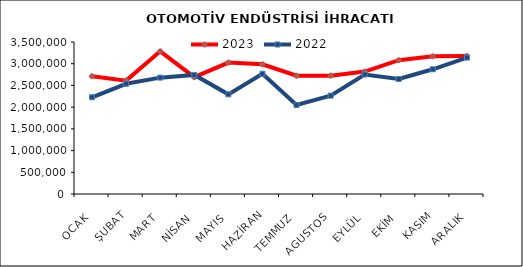
| Category | 2023 | 2022 |
|---|---|---|
| OCAK | 2711996.132 | 2227429.8 |
| ŞUBAT | 2610330.683 | 2537876.192 |
| MART | 3284639.724 | 2679350.728 |
| NİSAN | 2690029.23 | 2742241.719 |
| MAYIS | 3026163.643 | 2294857.869 |
| HAZİRAN | 2986020.086 | 2768701.719 |
| TEMMUZ | 2723195.638 | 2048166.688 |
| AGUSTOS | 2725645.44 | 2264566.848 |
| EYLÜL | 2818712.819 | 2751296.43 |
| EKİM | 3080989.174 | 2647880.514 |
| KASIM | 3170232.727 | 2872035.94 |
| ARALIK | 3176274.684 | 3141285.223 |